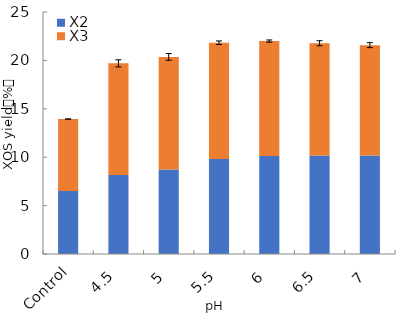
| Category | X2 | X3 |
|---|---|---|
| Control | 6.506 | 7.435 |
| 4.5 | 8.171 | 11.523 |
| 5 | 8.736 | 11.625 |
| 5.5 | 9.802 | 12.025 |
| 6 | 10.135 | 11.861 |
| 6.5 | 10.183 | 11.586 |
| 7 | 10.171 | 11.404 |